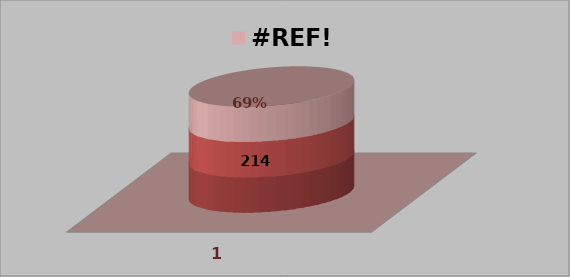
| Category | #REF! | Series 1 |
|---|---|---|
| 0 | 1 | 1 |